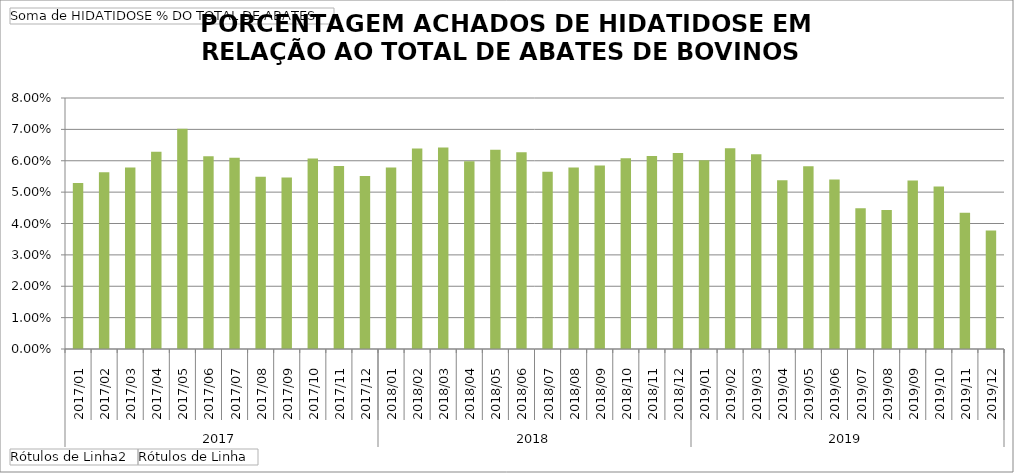
| Category | Total |
|---|---|
| 0 | 0.053 |
| 1 | 0.056 |
| 2 | 0.058 |
| 3 | 0.063 |
| 4 | 0.07 |
| 5 | 0.061 |
| 6 | 0.061 |
| 7 | 0.055 |
| 8 | 0.055 |
| 9 | 0.061 |
| 10 | 0.058 |
| 11 | 0.055 |
| 12 | 0.058 |
| 13 | 0.064 |
| 14 | 0.064 |
| 15 | 0.06 |
| 16 | 0.064 |
| 17 | 0.063 |
| 18 | 0.057 |
| 19 | 0.058 |
| 20 | 0.058 |
| 21 | 0.061 |
| 22 | 0.062 |
| 23 | 0.062 |
| 24 | 0.06 |
| 25 | 0.064 |
| 26 | 0.062 |
| 27 | 0.054 |
| 28 | 0.058 |
| 29 | 0.054 |
| 30 | 0.045 |
| 31 | 0.044 |
| 32 | 0.054 |
| 33 | 0.052 |
| 34 | 0.043 |
| 35 | 0.038 |